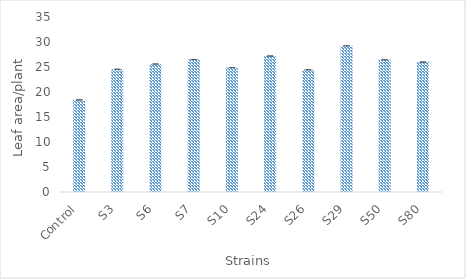
| Category | Leaf Area  |
|---|---|
| Control | 18.427 |
| S3 | 24.55 |
| S6 | 25.6 |
| S7 | 26.5 |
| S10 | 24.9 |
| S24 | 27.2 |
| S26 | 24.45 |
| S29 | 29.25 |
| S50 | 26.45 |
| S80 | 26 |